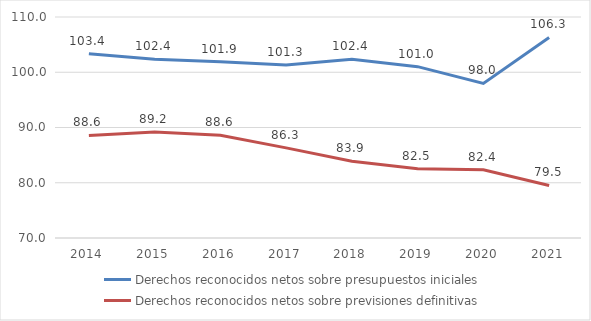
| Category | Derechos reconocidos netos sobre presupuestos iniciales | Derechos reconocidos netos sobre previsiones definitivas |
|---|---|---|
| 2014.0 | 103.366 | 88.568 |
| 2015.0 | 102.374 | 89.179 |
| 2016.0 | 101.879 | 88.614 |
| 2017.0 | 101.302 | 86.317 |
| 2018.0 | 102.364 | 83.877 |
| 2019.0 | 101.012 | 82.52 |
| 2020.0 | 97.979 | 82.357 |
| 2021.0 | 106.299 | 79.504 |